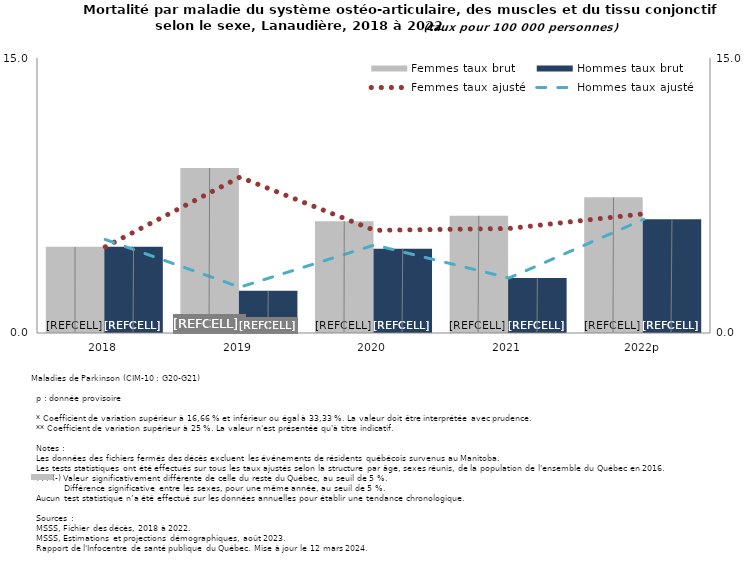
| Category | Femmes taux brut | Hommes taux brut |
|---|---|---|
| 2018 | 4.7 | 4.7 |
| 2019 | 9 | 2.3 |
| 2020 | 6.1 | 4.6 |
| 2021 | 6.4 | 3 |
| 2022p | 7.4 | 6.2 |